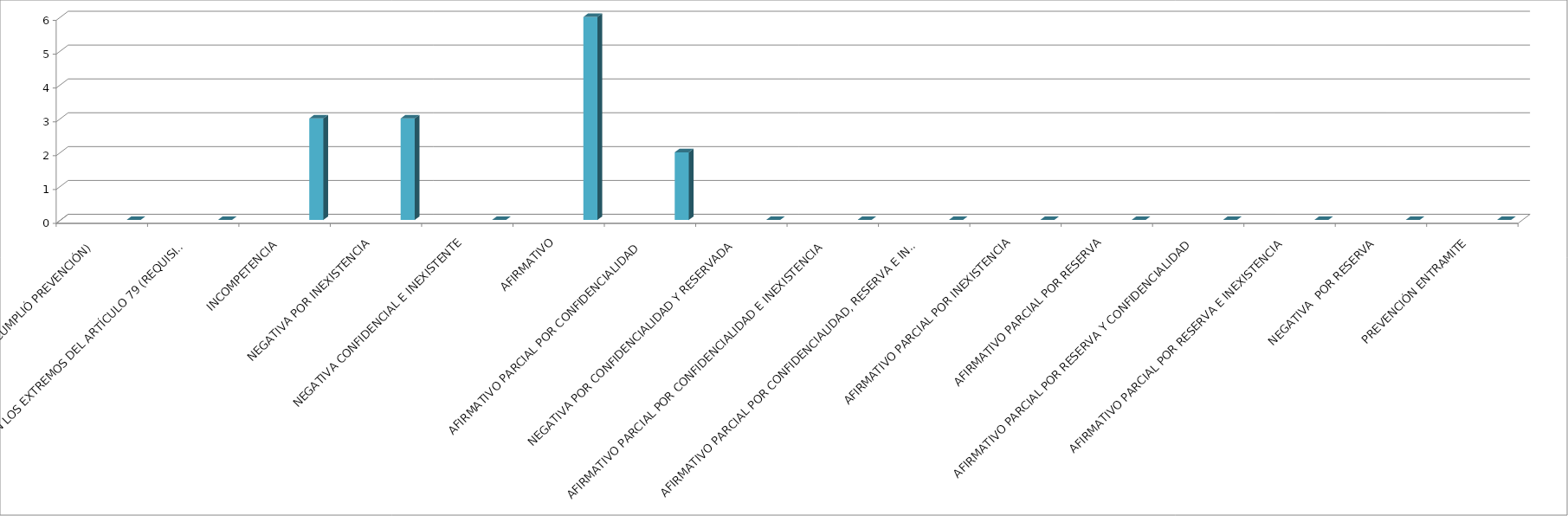
| Category | Series 0 | Series 1 | Series 2 | Series 3 | Series 4 |
|---|---|---|---|---|---|
| SE TIENE POR NO PRESENTADA ( NO CUMPLIÓ PREVENCIÓN) |  |  |  |  | 0 |
| NO CUMPLIO CON LOS EXTREMOS DEL ARTÍCULO 79 (REQUISITOS) |  |  |  |  | 0 |
| INCOMPETENCIA  |  |  |  |  | 3 |
| NEGATIVA POR INEXISTENCIA |  |  |  |  | 3 |
| NEGATIVA CONFIDENCIAL E INEXISTENTE |  |  |  |  | 0 |
| AFIRMATIVO |  |  |  |  | 6 |
| AFIRMATIVO PARCIAL POR CONFIDENCIALIDAD  |  |  |  |  | 2 |
| NEGATIVA POR CONFIDENCIALIDAD Y RESERVADA |  |  |  |  | 0 |
| AFIRMATIVO PARCIAL POR CONFIDENCIALIDAD E INEXISTENCIA |  |  |  |  | 0 |
| AFIRMATIVO PARCIAL POR CONFIDENCIALIDAD, RESERVA E INEXISTENCIA |  |  |  |  | 0 |
| AFIRMATIVO PARCIAL POR INEXISTENCIA |  |  |  |  | 0 |
| AFIRMATIVO PARCIAL POR RESERVA |  |  |  |  | 0 |
| AFIRMATIVO PARCIAL POR RESERVA Y CONFIDENCIALIDAD |  |  |  |  | 0 |
| AFIRMATIVO PARCIAL POR RESERVA E INEXISTENCIA |  |  |  |  | 0 |
| NEGATIVA  POR RESERVA |  |  |  |  | 0 |
| PREVENCIÓN ENTRAMITE |  |  |  |  | 0 |